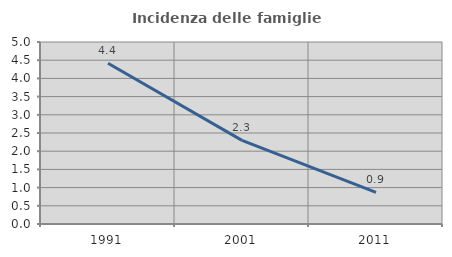
| Category | Incidenza delle famiglie numerose |
|---|---|
| 1991.0 | 4.417 |
| 2001.0 | 2.298 |
| 2011.0 | 0.867 |